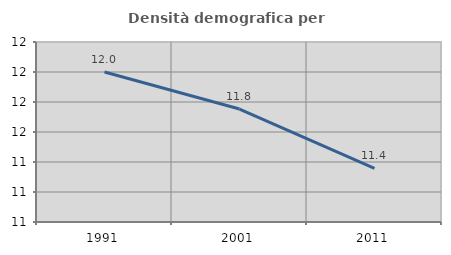
| Category | Densità demografica |
|---|---|
| 1991.0 | 12 |
| 2001.0 | 11.753 |
| 2011.0 | 11.358 |